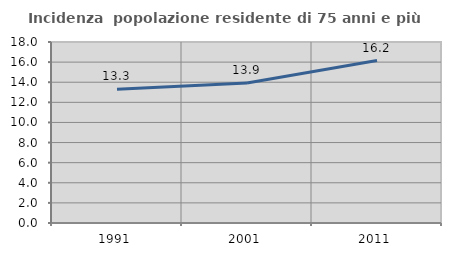
| Category | Incidenza  popolazione residente di 75 anni e più |
|---|---|
| 1991.0 | 13.299 |
| 2001.0 | 13.932 |
| 2011.0 | 16.158 |